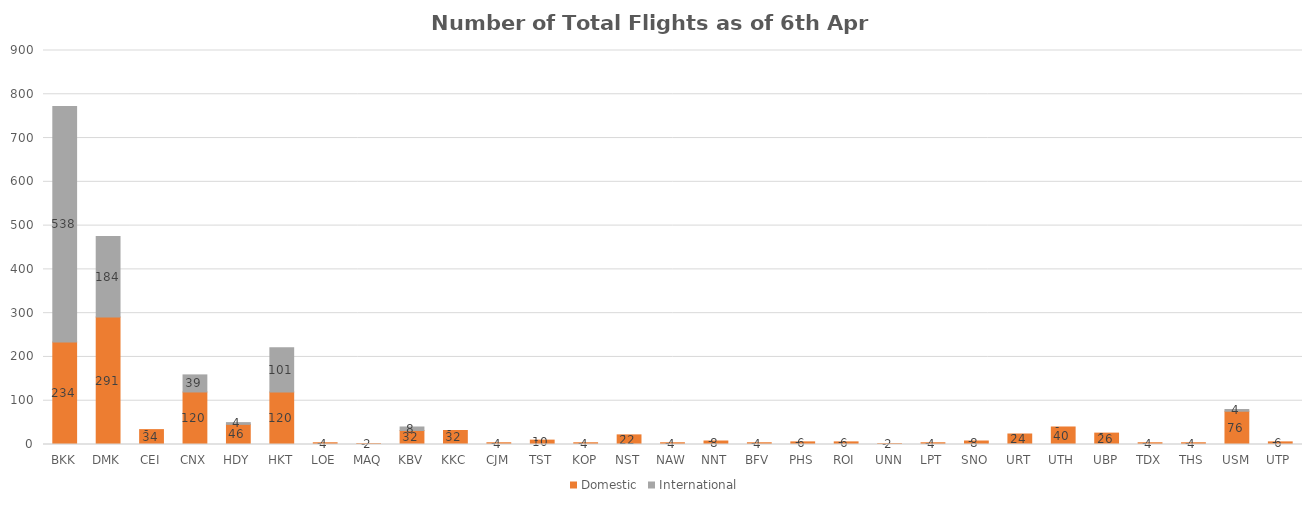
| Category | Domestic | International |
|---|---|---|
| BKK | 234 | 538 |
| DMK | 291 | 184 |
| CEI | 34 | 0 |
| CNX | 120 | 39 |
| HDY | 46 | 4 |
| HKT | 120 | 101 |
| LOE | 4 | 0 |
| MAQ | 2 | 0 |
| KBV | 32 | 8 |
| KKC | 32 | 0 |
| CJM | 4 | 0 |
| TST | 10 | 0 |
| KOP | 4 | 0 |
| NST | 22 | 0 |
| NAW | 4 | 0 |
| NNT | 8 | 0 |
| BFV | 4 | 0 |
| PHS | 6 | 0 |
| ROI | 6 | 0 |
| UNN | 2 | 0 |
| LPT | 4 | 0 |
| SNO | 8 | 0 |
| URT | 24 | 0 |
| UTH | 40 | 0 |
| UBP | 26 | 0 |
| TDX | 4 | 0 |
| THS | 4 | 0 |
| USM | 76 | 4 |
| UTP | 6 | 0 |